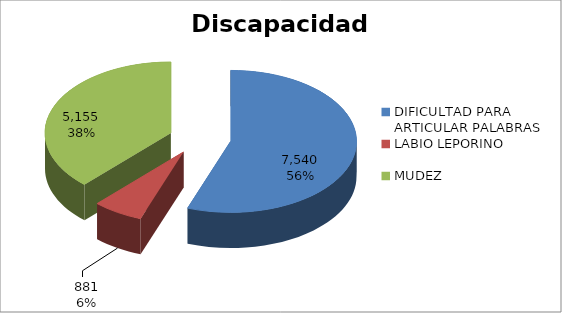
| Category | Series 0 |
|---|---|
| DIFICULTAD PARA ARTICULAR PALABRAS | 7540 |
| LABIO LEPORINO | 881 |
| MUDEZ | 5155 |